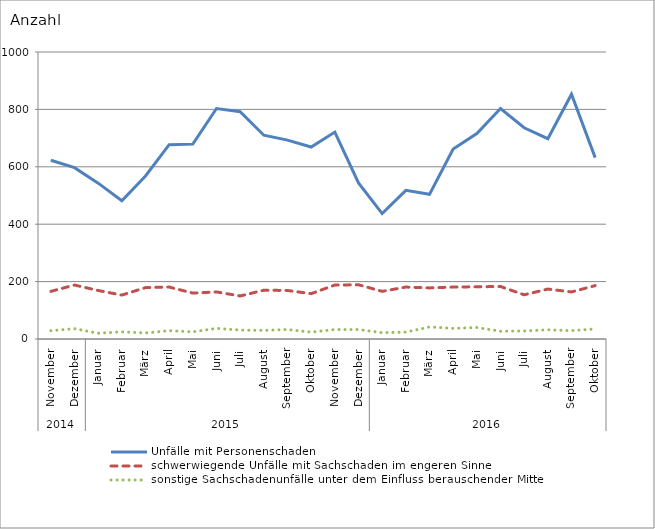
| Category | Unfälle mit Personenschaden | schwerwiegende Unfälle mit Sachschaden im engeren Sinne | sonstige Sachschadenunfälle unter dem Einfluss berauschender Mittel |
|---|---|---|---|
| 0 | 623 | 166 | 29 |
| 1 | 597 | 188 | 36 |
| 2 | 543 | 169 | 20 |
| 3 | 482 | 153 | 25 |
| 4 | 568 | 179 | 21 |
| 5 | 677 | 181 | 29 |
| 6 | 679 | 160 | 25 |
| 7 | 803 | 164 | 37 |
| 8 | 792 | 150 | 31 |
| 9 | 710 | 170 | 30 |
| 10 | 693 | 169 | 33 |
| 11 | 669 | 158 | 24 |
| 12 | 721 | 188 | 33 |
| 13 | 544 | 189 | 33 |
| 14 | 437 | 166 | 22 |
| 15 | 518 | 181 | 24 |
| 16 | 504 | 178 | 42 |
| 17 | 662 | 181 | 37 |
| 18 | 716 | 182 | 40 |
| 19 | 803 | 183 | 27 |
| 20 | 736 | 154 | 28 |
| 21 | 698 | 174 | 32 |
| 22 | 853 | 164 | 29 |
| 23 | 632 | 186 | 35 |